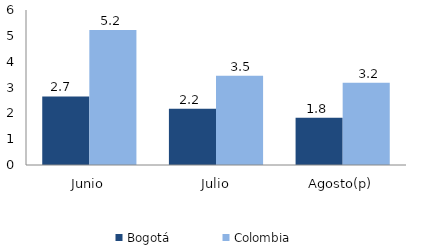
| Category | Bogotá | Colombia |
|---|---|---|
| Junio | 2.655 | 5.23 |
| Julio | 2.181 | 3.458 |
| Agosto(p) | 1.829 | 3.187 |